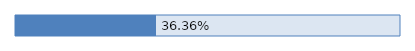
| Category | Series 0 |
|---|---|
| 0 | 0.364 |